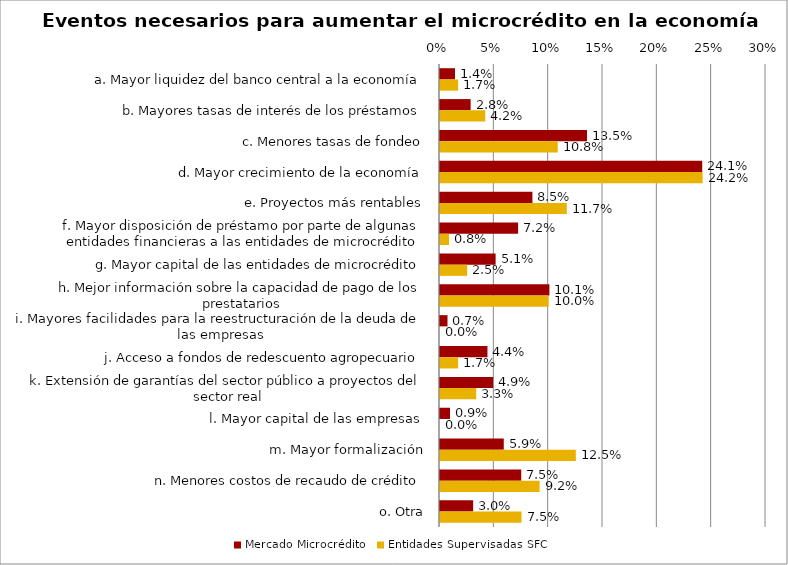
| Category | Mercado Microcrédito | Entidades Supervisadas SFC |
|---|---|---|
| a. Mayor liquidez del banco central a la economía | 0.014 | 0.017 |
| b. Mayores tasas de interés de los préstamos | 0.028 | 0.042 |
| c. Menores tasas de fondeo | 0.135 | 0.108 |
| d. Mayor crecimiento de la economía | 0.241 | 0.242 |
| e. Proyectos más rentables | 0.085 | 0.117 |
| f. Mayor disposición de préstamo por parte de algunas entidades financieras a las entidades de microcrédito | 0.072 | 0.008 |
| g. Mayor capital de las entidades de microcrédito | 0.051 | 0.025 |
| h. Mejor información sobre la capacidad de pago de los prestatarios | 0.101 | 0.1 |
| i. Mayores facilidades para la reestructuración de la deuda de las empresas | 0.007 | 0 |
| j. Acceso a fondos de redescuento agropecuario | 0.044 | 0.017 |
| k. Extensión de garantías del sector público a proyectos del sector real | 0.049 | 0.033 |
| l. Mayor capital de las empresas | 0.009 | 0 |
| m. Mayor formalización | 0.059 | 0.125 |
| n. Menores costos de recaudo de crédito | 0.075 | 0.092 |
| o. Otra | 0.03 | 0.075 |